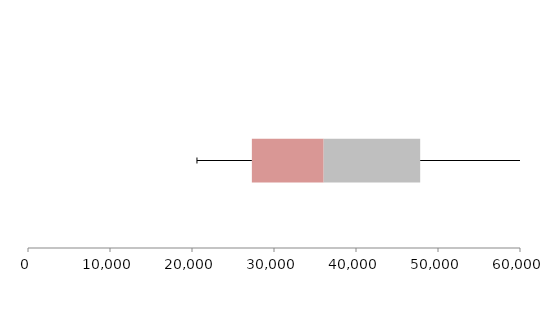
| Category | Series 1 | Series 2 | Series 3 |
|---|---|---|---|
| 0 | 27300.201 | 8753.823 | 11773.282 |